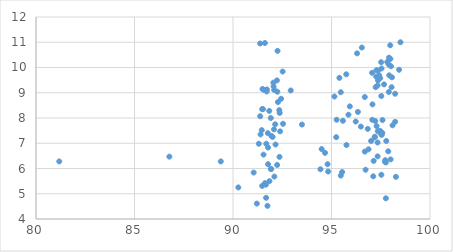
| Category | Series 0 |
|---|---|
| 97.99 | 10.34 |
| 97.83 | 10.22 |
| 91.52 | 8.35 |
| 97.9 | 10.12 |
| 92.05 | 9.4 |
| 92.06 | 9.25 |
| 92.93 | 9.09 |
| 92.09 | 9.11 |
| 97.24 | 9.22 |
| 91.84 | 8.28 |
| 97.27 | 9.64 |
| 97.67 | 9.33 |
| 92.54 | 7.77 |
| 97.53 | 8.87 |
| 97.54 | 9.96 |
| 97.91 | 9.03 |
| 98.02 | 10.05 |
| 96.34 | 8.24 |
| 96.54 | 10.79 |
| 98.5 | 11 |
| 92.37 | 8.2 |
| 92.35 | 8.31 |
| 92.26 | 10.66 |
| 97.98 | 10.88 |
| 98.43 | 9.91 |
| 97.42 | 9.69 |
| 97.06 | 9.79 |
| 97.52 | 10.21 |
| 96.69 | 6.67 |
| 91.78 | 6.83 |
| 92.52 | 9.84 |
| 95.47 | 9.02 |
| 96.69 | 8.83 |
| 91.71 | 9.05 |
| 97.92 | 10.39 |
| 92.23 | 9.49 |
| 91.72 | 9.13 |
| 91.62 | 10.97 |
| 91.38 | 10.95 |
| 96.3 | 10.56 |
| 86.77 | 6.47 |
| 93.5 | 7.74 |
| 91.4 | 7.35 |
| 91.92 | 8 |
| 95.26 | 7.93 |
| 96.49 | 7.66 |
| 81.18 | 6.28 |
| 91.5 | 9.15 |
| 91.54 | 9.12 |
| 98.07 | 9.61 |
| 95.58 | 7.89 |
| 97.36 | 9.49 |
| 91.46 | 7.52 |
| 92.14 | 7.75 |
| 95.93 | 8.46 |
| 92.28 | 8.63 |
| 95.75 | 9.73 |
| 95.15 | 8.85 |
| 98.23 | 8.96 |
| 92.25 | 9.04 |
| 91.31 | 6.98 |
| 97.29 | 7.68 |
| 97.08 | 8.54 |
| 91.77 | 7.4 |
| 97.22 | 7.88 |
| 95.76 | 6.93 |
| 92.16 | 6.95 |
| 92.01 | 7.25 |
| 96.84 | 7.57 |
| 91.95 | 7.29 |
| 92.39 | 7.47 |
| 92.08 | 7.55 |
| 92.44 | 8.76 |
| 98.05 | 9.22 |
| 97.34 | 9.29 |
| 97.28 | 9.89 |
| 97.07 | 7.93 |
| 97.19 | 7.23 |
| 91.48 | 8.35 |
| 97.47 | 9.58 |
| 95.86 | 8.13 |
| 97.36 | 9.88 |
| 97.93 | 9.69 |
| 98.1 | 7.71 |
| 91.92 | 5.98 |
| 91.38 | 8.07 |
| 97.58 | 7.41 |
| 97.35 | 7.48 |
| 95.24 | 7.24 |
| 95.4 | 9.59 |
| 97.47 | 7.49 |
| 97.2 | 7.26 |
| 97.76 | 6.24 |
| 97.01 | 7.09 |
| 97.59 | 7.92 |
| 97.34 | 7.03 |
| 97.72 | 6.26 |
| 95.47 | 5.72 |
| 97.34 | 6.48 |
| 97.73 | 6.33 |
| 94.8 | 6.17 |
| 94.67 | 6.62 |
| 97.53 | 5.75 |
| 96.88 | 6.76 |
| 91.78 | 6.17 |
| 94.5 | 6.77 |
| 94.83 | 5.88 |
| 91.75 | 4.52 |
| 92.24 | 6.14 |
| 94.44 | 5.97 |
| 97.14 | 6.3 |
| 91.94 | 5.98 |
| 91.05 | 5.84 |
| 98.0 | 6.36 |
| 97.12 | 5.69 |
| 91.21 | 4.61 |
| 96.73 | 5.95 |
| 91.68 | 4.84 |
| 91.62 | 5.42 |
| 90.27 | 5.25 |
| 91.55 | 6.55 |
| 89.38 | 6.28 |
| 91.69 | 6.98 |
| 91.85 | 5.5 |
| 92.36 | 6.46 |
| 91.67 | 5.36 |
| 97.55 | 7.33 |
| 97.78 | 7.09 |
| 96.23 | 7.86 |
| 97.48 | 7.4 |
| 92.1 | 5.68 |
| 95.54 | 5.86 |
| 98.23 | 7.85 |
| 98.27 | 5.67 |
| 97.76 | 4.82 |
| 97.88 | 6.68 |
| 91.48 | 5.31 |